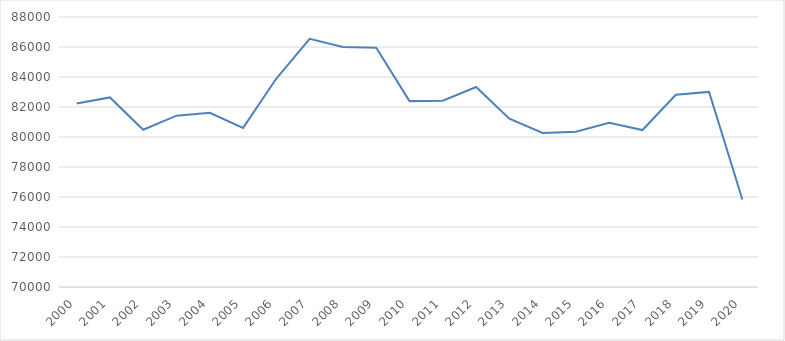
| Category | Series 0 |
|---|---|
| 2000 | 82226.648 |
| 2001 | 82637.303 |
| 2002 | 80483.94 |
| 2003 | 81421.75 |
| 2004 | 81612.264 |
| 2005 | 80608.679 |
| 2006 | 83897.368 |
| 2007 | 86547.311 |
| 2008 | 86002.875 |
| 2009 | 85952.912 |
| 2010 | 82392.022 |
| 2011 | 82418.97 |
| 2012 | 83333.491 |
| 2013 | 81217.244 |
| 2014 | 80268.92 |
| 2015 | 80357 |
| 2016 | 80941.608 |
| 2017 | 80463.145 |
| 2018 | 82820.119 |
| 2019 | 83007.51 |
| 2020 | 75837.691 |